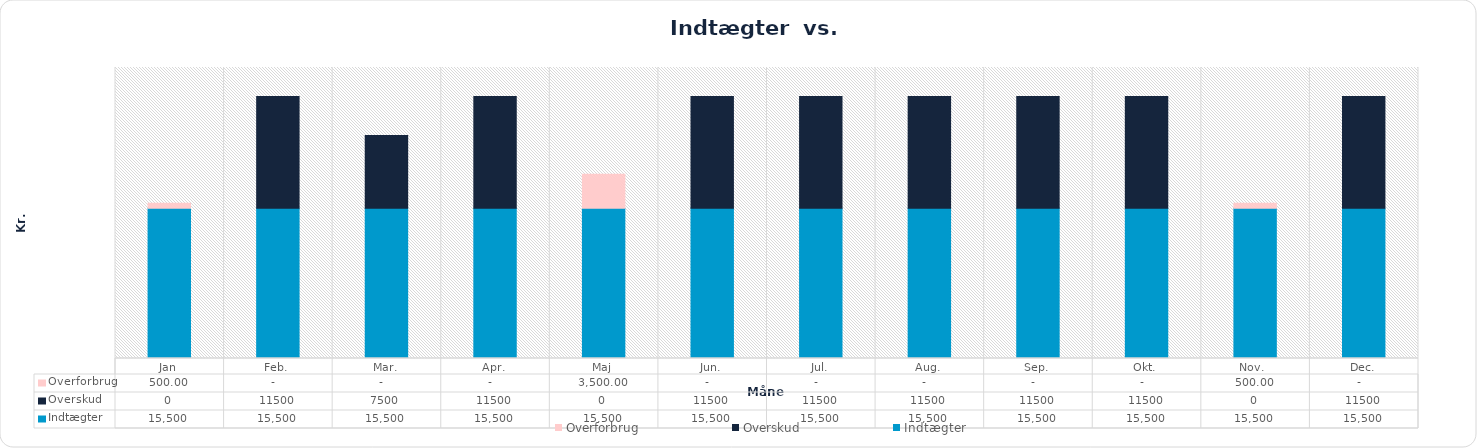
| Category | Indtægter | Overskud | Overforbrug |
|---|---|---|---|
| Jan | 15500 | 0 | 500 |
| Feb. | 15500 | 11500 | 0 |
| Mar. | 15500 | 7500 | 0 |
| Apr. | 15500 | 11500 | 0 |
| Maj | 15500 | 0 | 3500 |
| Jun. | 15500 | 11500 | 0 |
| Jul. | 15500 | 11500 | 0 |
| Aug. | 15500 | 11500 | 0 |
| Sep. | 15500 | 11500 | 0 |
| Okt. | 15500 | 11500 | 0 |
| Nov.  | 15500 | 0 | 500 |
| Dec. | 15500 | 11500 | 0 |